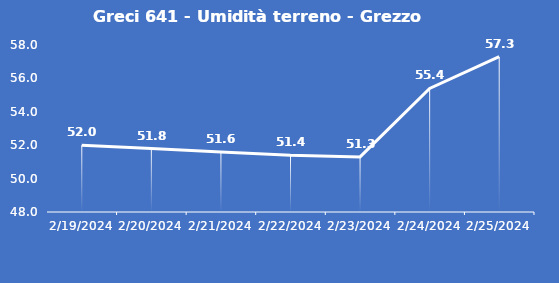
| Category | Greci 641 - Umidità terreno - Grezzo (%VWC) |
|---|---|
| 2/19/24 | 52 |
| 2/20/24 | 51.8 |
| 2/21/24 | 51.6 |
| 2/22/24 | 51.4 |
| 2/23/24 | 51.3 |
| 2/24/24 | 55.4 |
| 2/25/24 | 57.3 |